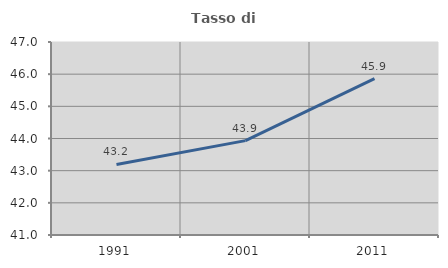
| Category | Tasso di occupazione   |
|---|---|
| 1991.0 | 43.192 |
| 2001.0 | 43.934 |
| 2011.0 | 45.858 |